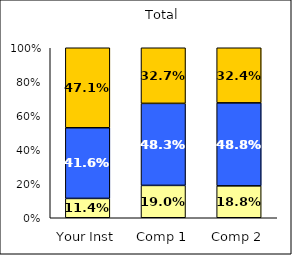
| Category | Low Faculty Interaction | Average Faculty Interaction | High Faculty Interaction |
|---|---|---|---|
| Your Inst | 0.114 | 0.416 | 0.471 |
| Comp 1 | 0.19 | 0.483 | 0.327 |
| Comp 2 | 0.188 | 0.488 | 0.324 |